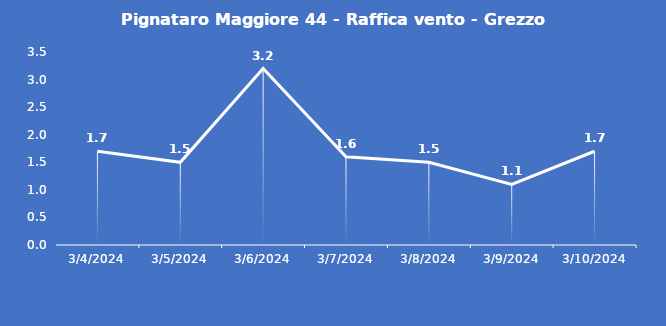
| Category | Pignataro Maggiore 44 - Raffica vento - Grezzo (m/s) |
|---|---|
| 3/4/24 | 1.7 |
| 3/5/24 | 1.5 |
| 3/6/24 | 3.2 |
| 3/7/24 | 1.6 |
| 3/8/24 | 1.5 |
| 3/9/24 | 1.1 |
| 3/10/24 | 1.7 |